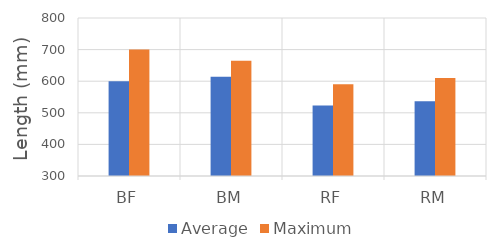
| Category | Average | Maximum |
|---|---|---|
| BF | 599.722 | 700 |
| BM | 614 | 665 |
| RF | 522.983 | 590 |
| RM | 536.414 | 610 |